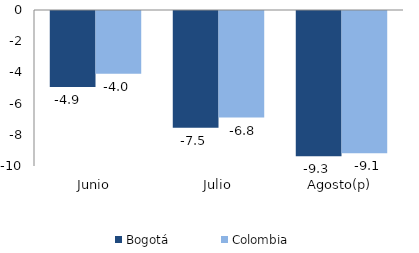
| Category | Bogotá | Colombia |
|---|---|---|
| Junio | -4.873 | -4.017 |
| Julio | -7.486 | -6.833 |
| Agosto(p) | -9.315 | -9.116 |